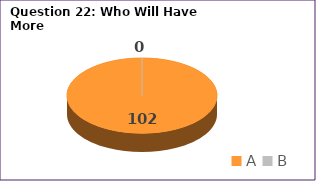
| Category | Series 0 |
|---|---|
| A | 102 |
| B | 0 |